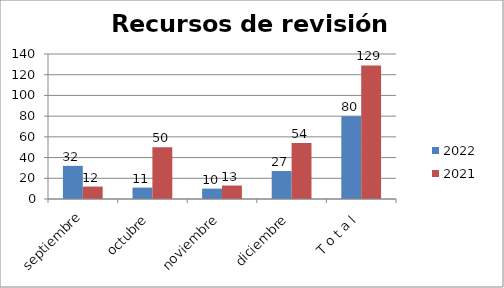
| Category | 2022 | 2021 |
|---|---|---|
| septiembre | 32 | 12 |
| octubre | 11 | 50 |
| noviembre | 10 | 13 |
| diciembre | 27 | 54 |
| T o t a l | 80 | 129 |